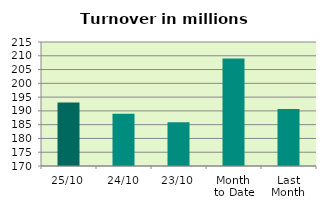
| Category | Series 0 |
|---|---|
| 25/10 | 193.03 |
| 24/10 | 188.927 |
| 23/10 | 185.851 |
| Month 
to Date | 208.981 |
| Last
Month | 190.73 |